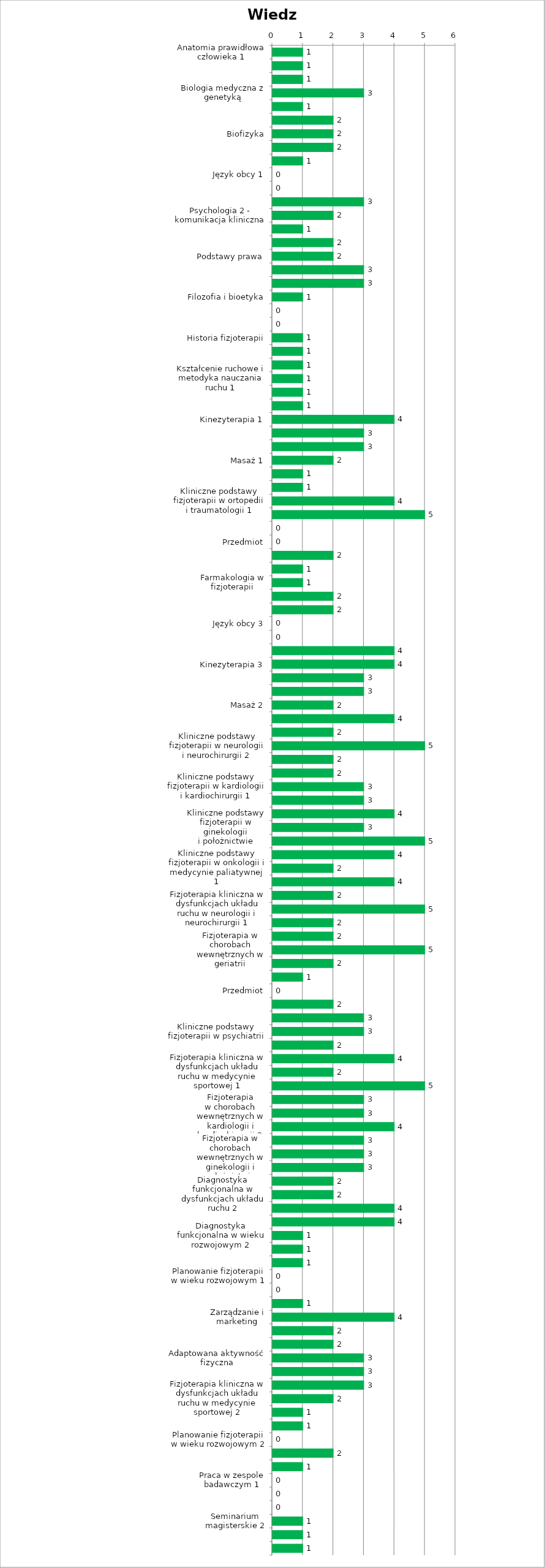
| Category | Wiedza |
|---|---|
| Anatomia prawidłowa człowieka 1 | 1 |
| Anatomia prawidłowa człowieka 2 | 1 |
| Anatomia rentgenowska | 1 |
| Biologia medyczna z genetyką | 3 |
| Biochemia | 1 |
| Fizjologia 1 - fizjologia ogólna, fizjologia bólu i diagnostyka fizjologiczna | 2 |
| Biofizyka | 2 |
| Ergonomia | 2 |
| Pierwsza pomoc | 1 |
| Język obcy 1 | 0 |
| Język obcy 2 | 0 |
| Psychologia 1 - psychologia ogólna, kliniczna i psychoterapia | 3 |
| Psychologia 2 - komunikacja kliniczna | 2 |
| Socjologia ogólna i niepełnosprawności | 1 |
| Pedagogika ogólna i specjalna | 2 |
| Podstawy prawa | 2 |
| Zdrowie publiczne z demografią i epidemiologią | 3 |
| Ekonomia, system ochrony zdrowia i technologie informacyjne | 3 |
| Filozofia i bioetyka | 1 |
| Wychowanie fizyczne 1 | 0 |
| Wychowanie fizyczne 2 | 0 |
| Historia fizjoterapii | 1 |
| Fizjoterapia ogólna 1 | 1 |
| Fizjoterapia ogólna 2 | 1 |
| Kształcenie ruchowe i metodyka nauczania ruchu 1 | 1 |
| Kształcenie ruchowe i metodyka nauczania ruchu 2 | 1 |
| Kształcenie ruchowe i metodyka nauczania ruchu 3 - pływanie | 1 |
| Kinezyterapia 1 | 4 |
| Medycyna fizykalna 1 – podstawy fizykoterapii | 3 |
| Medycyna fizykalna 2 – nowoczesne metody fizykoterapii | 3 |
| Masaż 1 | 2 |
| Fizjoprofilaktyka | 1 |
| Promocja zdrowia | 1 |
| Kliniczne podstawy fizjoterapii w ortopedii i traumatologii 1 | 4 |
| Kliniczne podstawy fizjoterapii w neurologii i neurochirurgii 1 | 5 |
| Rozwój psychomotoryczny dziecka | 0 |
| Przedmiot | 0 |
| Anatomia palpacyjna i funkcjonalna | 2 |
| Fizjologia 2 - fizjologia wysiłku fizycznego | 1 |
| Farmakologia w fizjoterapii | 1 |
| Biomechanika | 2 |
| Patologia ogólna | 2 |
| Język obcy 3 | 0 |
| Język obcy 4 | 0 |
| Kinezyterapia 2 | 4 |
| Kinezyterapia 3 | 4 |
| Terapia manualna | 3 |
| Medycyna fizykalna 3 – balneoklimatologia i odnowa biologiczna | 3 |
| Masaż 2 | 2 |
| Kliniczne podstawy fizjoterapii w ortopedii i traumatologii 2 | 4 |
| Kliniczne podstawy fizjoterapii w reumatologii | 2 |
| Kliniczne podstawy fizjoterapii w neurologii i neurochirurgii 2 | 5 |
| Kliniczne podstawy fizjoterapii w pediatrii | 2 |
| Kliniczne podstawy fizjoterapii w neurologii dziecięcej | 2 |
| Kliniczne podstawy fizjoterapii w kardiologii i kardiochirurgii 1 | 3 |
| Kliniczne podstawy fizjoterapii w kardiologii i kardiochirurgii 2 | 3 |
| Kliniczne podstawy fizjoterapii w pulmonologii | 4 |
| Kliniczne podstawy fizjoterapii w ginekologii i położnictwie | 3 |
| Kliniczne podstawy fizjoterapii w geriatrii | 5 |
| Kliniczne podstawy fizjoterapii w intensywnej terapii | 4 |
| Kliniczne podstawy fizjoterapii w onkologii i medycynie paliatywnej 1 | 2 |
| Fizjoterapia kliniczna w dysfunkcjach układu ruchu w ortopedii i traumatologii 1 | 4 |
| Fizjoterapia kliniczna w dysfunkcjach układu ruchu w reumatologii | 2 |
| Fizjoterapia kliniczna w dysfunkcjach układu ruchu w neurologii i neurochirurgii 1 | 5 |
| Fizjoterapia kliniczna w dysfunkcjach układu ruchu w wieku rozwojowym | 2 |
| Fizjoterapia w chorobach wewnętrznych w pediatrii | 2 |
| Fizjoterapia w chorobach wewnętrznych w geriatrii | 5 |
| Diagnostyka funkcjonalna w dysfunkcjach układu ruchu 1 | 2 |
| Diagnostyka funkcjonalna w wieku rozwojowym 1 | 1 |
| Przedmiot | 0 |
| Kliniczne podstawy fizjoterapii w medycynie sportowej | 2 |
| Kliniczne podstawy fizjoterapii w chirurgii | 3 |
| Kliniczne podstawy fizjoterapii w psychiatrii | 3 |
| Kliniczne podstawy fizjoterapii w onkologii i medycynie paliatywnej 2 | 2 |
| Fizjoterapia kliniczna w dysfunkcjach układu ruchu w ortopedii i traumatologii 2 | 4 |
| Fizjoterapia kliniczna w dysfunkcjach układu ruchu w medycynie sportowej 1 | 2 |
| Fizjoterapia kliniczna w dysfunkcjach układu ruchu w neurologii i neurochirurgii 2 | 5 |
| Fizjoterapia w chorobach wewnętrznych w kardiologii i kardiochirurgii 1 | 3 |
| Fizjoterapia w chorobach wewnętrznych w kardiologii i kardiochirurgii 2 | 3 |
| Fizjoterapia w chorobach wewnętrznych w pulmonologii | 4 |
| Fizjoterapia w chorobach wewnętrznych w chirurgii  | 3 |
| Fizjoterapia w chorobach wewnętrznych w ginekologii i położnictwie | 3 |
| Fizjoterapia w chorobach wewnętrznych w psychiatrii | 3 |
| Fizjoterapia w chorobach wewnętrznych w onkologii i medycynie paliatywnej | 2 |
| Diagnostyka funkcjonalna w dysfunkcjach układu ruchu 2 | 2 |
| Diagnostyka funkcjonalna w chorobach wewnętrznych 1 | 4 |
| Diagnostyka funkcjonalna w chorobach wewnętrznych 2 | 4 |
| Diagnostyka funkcjonalna w wieku rozwojowym 2 | 1 |
| Planowanie fizjoterapii w dysfunkcjach układu ruchu 1 | 1 |
| Planowanie fizjoterapii w chorobach wewnętrznych 1 | 1 |
| Planowanie fizjoterapii w wieku rozwojowym 1 | 0 |
| Przedmiot | 0 |
| Dydaktyka fizjoterapii | 1 |
| Zarządzanie i marketing | 4 |
| Metody specjalne fizjoterapii 1 | 2 |
| Metody specjalne fizjoterapii 2 | 2 |
| Adaptowana aktywność fizyczna | 3 |
| Sport osób z niepełnosprawnościami | 3 |
| Wyroby medyczne | 3 |
| Fizjoterapia kliniczna w dysfunkcjach układu ruchu w medycynie sportowej 2 | 2 |
| Planowanie fizjoterapii w dysfunkcjach układu ruchu 2 | 1 |
| Planowanie fizjoterapii w chorobach wewnętrznych 2 | 1 |
| Planowanie fizjoterapii w wieku rozwojowym 2 | 0 |
| Metodologia badań naukowych | 2 |
| Seminarium magisterskie 1 | 1 |
| Praca w zespole badawczym 1 | 0 |
| Praca w zespole badawczym 2 | 0 |
| Przedmiot | 0 |
| Seminarium magisterskie 2 | 1 |
| Seminarium magisterskie 3 | 1 |
| Praca magisterska | 1 |